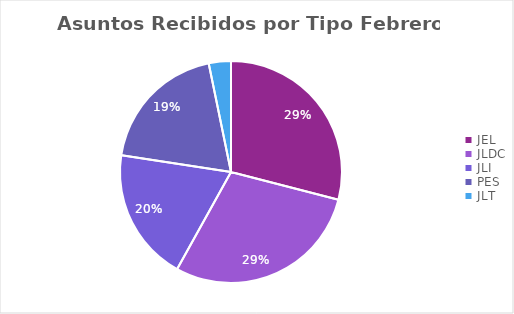
| Category | Series 0 |
|---|---|
| JEL | 9 |
| JLDC | 9 |
| JLI | 6 |
| PES | 6 |
| JLT | 1 |